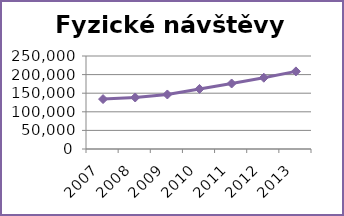
| Category | Fyzické návštěvy celkem |
|---|---|
| 2007.0 | 134159 |
| 2008.0 | 138470 |
| 2009.0 | 146561 |
| 2010.0 | 161439 |
| 2011.0 | 176105 |
| 2012.0 | 191625 |
| 2013.0 | 208608 |